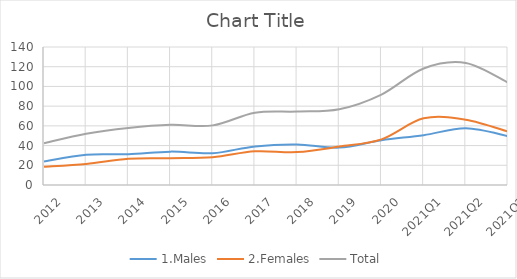
| Category | 1.Males | 2.Females | Total |
|---|---|---|---|
| 2012 | 23.953 | 18.496 | 42.45 |
| 2013 | 30.784 | 21.275 | 52.059 |
| 2014 | 31.293 | 26.624 | 57.917 |
| 2015 | 33.857 | 27.204 | 61.061 |
| 2016 | 32.309 | 28.177 | 60.487 |
| 2017 | 39.179 | 34.176 | 73.356 |
| 2018 | 41.134 | 33.397 | 74.531 |
| 2019 | 37.943 | 38.951 | 76.894 |
| 2020 | 45.443 | 46.332 | 91.775 |
| 2021Q1 | 50.56 | 67.648 | 118.208 |
| 2021Q2 | 57.522 | 66.295 | 123.817 |
| 2021Q3 | 49.582 | 54.23 | 103.812 |